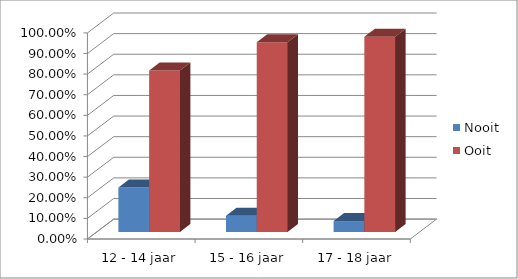
| Category | Nooit | Ooit |
|---|---|---|
| 12 - 14 jaar | 0.216 | 0.784 |
| 15 - 16 jaar | 0.079 | 0.921 |
| 17 - 18 jaar | 0.053 | 0.947 |